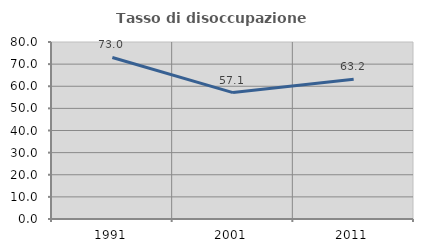
| Category | Tasso di disoccupazione giovanile  |
|---|---|
| 1991.0 | 73.016 |
| 2001.0 | 57.143 |
| 2011.0 | 63.158 |